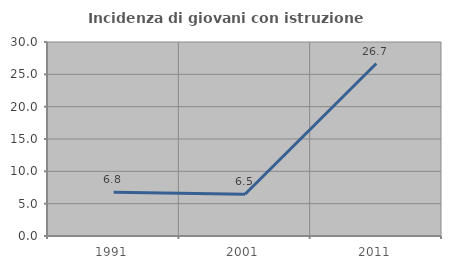
| Category | Incidenza di giovani con istruzione universitaria |
|---|---|
| 1991.0 | 6.757 |
| 2001.0 | 6.452 |
| 2011.0 | 26.667 |